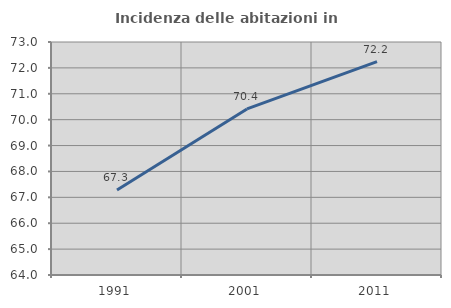
| Category | Incidenza delle abitazioni in proprietà  |
|---|---|
| 1991.0 | 67.287 |
| 2001.0 | 70.415 |
| 2011.0 | 72.241 |